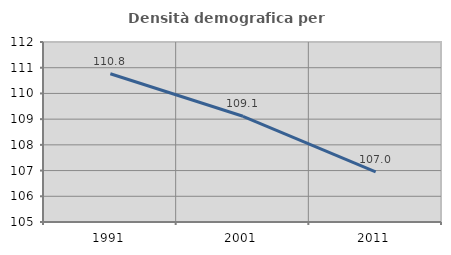
| Category | Densità demografica |
|---|---|
| 1991.0 | 110.766 |
| 2001.0 | 109.111 |
| 2011.0 | 106.953 |